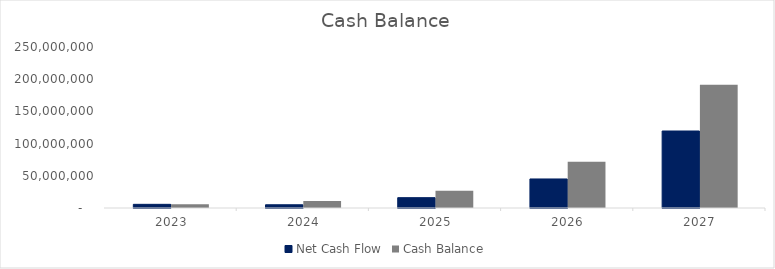
| Category | Net Cash Flow | Cash Balance |
|---|---|---|
| 2023-12-01 | 5681061.697 | 5681061.697 |
| 2024-12-01 | 5011706.785 | 10692768.482 |
| 2025-12-01 | 16039000.911 | 26731769.392 |
| 2026-12-01 | 45089270.718 | 71821040.11 |
| 2027-12-01 | 119549353.054 | 191370393.164 |